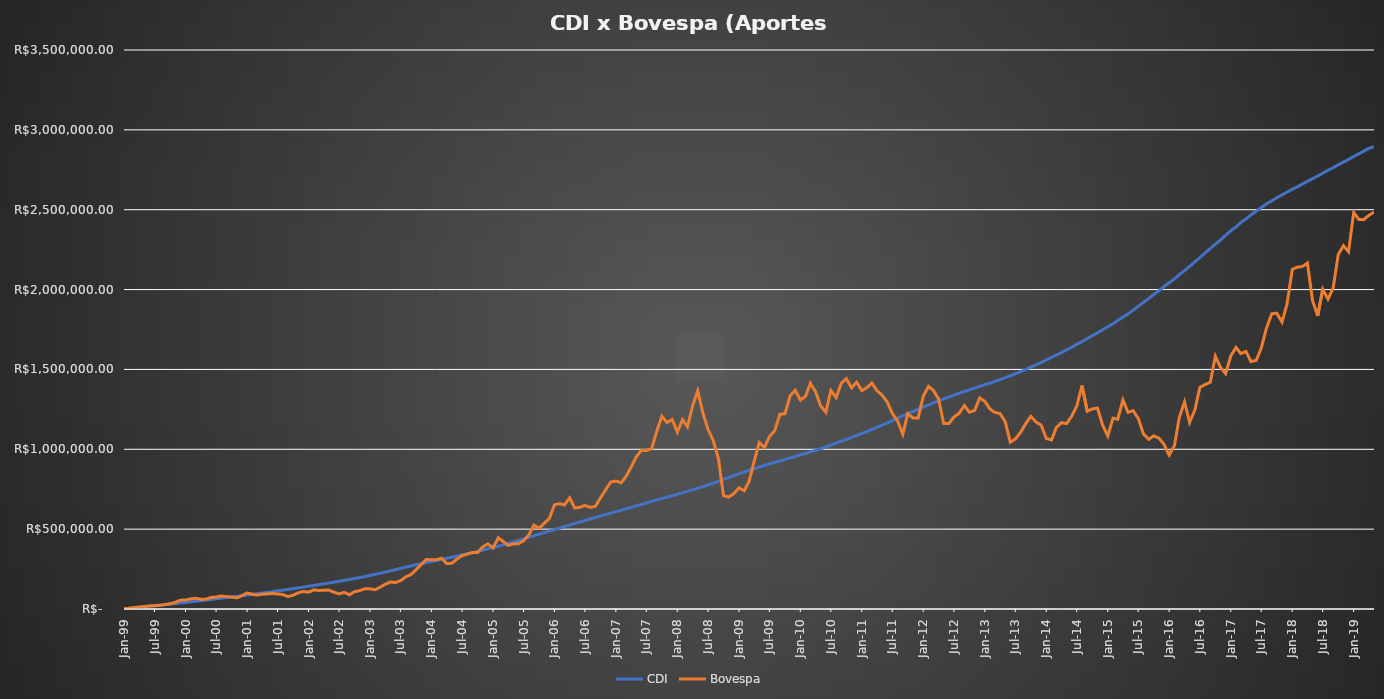
| Category | CDI | Bovespa |
|---|---|---|
| 1999-01-01 | 1000 | 1000 |
| 1999-01-01 | 1021.7 | 1204.5 |
| 1999-02-01 | 4116.21 | 4585.428 |
| 1999-03-01 | 7349.622 | 9104.789 |
| 1999-04-01 | 10585.593 | 12845.602 |
| 1999-05-01 | 13851.871 | 15481.153 |
| 1999-06-01 | 17128.241 | 19375.641 |
| 1999-07-01 | 20454.319 | 20095.563 |
| 1999-08-01 | 23817.861 | 23368.091 |
| 1999-09-01 | 27212.083 | 27718.137 |
| 1999-10-01 | 30629.01 | 32361.557 |
| 1999-11-01 | 34089.728 | 41645.306 |
| 1999-12-01 | 37675.745 | 55378.038 |
| 2000-01-01 | 41261.476 | 55972.862 |
| 2000-02-01 | 44898.841 | 63549.157 |
| 2000-03-01 | 48588.584 | 67154.754 |
| 2000-04-01 | 52248.918 | 61167.93 |
| 2000-05-01 | 56072.127 | 61768.049 |
| 2000-06-01 | 59893.23 | 72436.586 |
| 2000-07-01 | 63710.842 | 74206.97 |
| 2000-08-01 | 67644.794 | 81391.588 |
| 2000-09-01 | 71506.66 | 77488.356 |
| 2000-10-01 | 75460.345 | 75127.831 |
| 2000-11-01 | 79409.716 | 69822.843 |
| 2000-12-01 | 83390.391 | 83629.753 |
| 2001-01-01 | 87478.91 | 100334.58 |
| 2001-02-01 | 91392.747 | 92918.454 |
| 2001-03-01 | 95572.656 | 87151.507 |
| 2001-04-01 | 99735.814 | 93144.537 |
| 2001-05-01 | 104102.2 | 94423.55 |
| 2001-06-01 | 108462.398 | 96819.524 |
| 2001-07-01 | 113134.334 | 94299.505 |
| 2001-08-01 | 117992.483 | 90838.817 |
| 2001-09-01 | 122589.584 | 77726.692 |
| 2001-10-01 | 127523.664 | 86256.471 |
| 2001-11-01 | 132337.943 | 101564.938 |
| 2001-12-01 | 137219.14 | 109782.729 |
| 2002-01-01 | 142364.493 | 105666.139 |
| 2002-02-01 | 147181.549 | 119869.617 |
| 2002-03-01 | 152239.036 | 116050.354 |
| 2002-04-01 | 157536.574 | 117526.509 |
| 2002-05-01 | 162784.086 | 118465.506 |
| 2002-06-01 | 167955.858 | 105201.275 |
| 2002-07-01 | 173588.578 | 94827.597 |
| 2002-08-01 | 179149.112 | 104039.649 |
| 2002-09-01 | 184662.77 | 88896.429 |
| 2002-10-01 | 190740.439 | 108364.269 |
| 2002-11-01 | 196704.668 | 115094.972 |
| 2002-12-01 | 203159.559 | 126633.238 |
| 2003-01-01 | 210220.902 | 125860.911 |
| 2003-02-01 | 217122.845 | 121077.712 |
| 2003-03-01 | 224019.019 | 136063.619 |
| 2003-04-01 | 231264.275 | 154889.059 |
| 2003-05-01 | 238855.854 | 168767.615 |
| 2003-06-01 | 246330.188 | 166013.4 |
| 2003-07-01 | 254516.256 | 176821.819 |
| 2003-08-01 | 262048.542 | 201058.776 |
| 2003-09-01 | 269474.852 | 215302.414 |
| 2003-10-01 | 276916.192 | 245197.272 |
| 2003-11-01 | 283667.069 | 278576.618 |
| 2003-12-01 | 290594.408 | 310212.96 |
| 2004-01-01 | 297293.698 | 307794.376 |
| 2004-02-01 | 303536.87 | 309426.881 |
| 2004-03-01 | 310736.425 | 317988.079 |
| 2004-04-01 | 317407.141 | 284234.944 |
| 2004-05-01 | 324316.108 | 286315.792 |
| 2004-06-01 | 331309.365 | 313068.619 |
| 2004-07-01 | 338588.525 | 333831.675 |
| 2004-08-01 | 345995.016 | 343871.457 |
| 2004-09-01 | 353322.555 | 353600.763 |
| 2004-10-01 | 360634.058 | 353640.977 |
| 2004-11-01 | 368179.483 | 388774.329 |
| 2004-12-01 | 376672.94 | 408424.738 |
| 2005-01-01 | 384912.426 | 382460.437 |
| 2005-02-01 | 392644.958 | 445399.534 |
| 2005-03-01 | 401658.761 | 424051.44 |
| 2005-04-01 | 410364.45 | 398695.224 |
| 2005-05-01 | 419564.916 | 407559.974 |
| 2005-06-01 | 429241.442 | 408014.503 |
| 2005-07-01 | 438768.288 | 427290.677 |
| 2005-08-01 | 449057.465 | 463380.03 |
| 2005-09-01 | 458838.327 | 525237.19 |
| 2005-10-01 | 468304.063 | 504994.753 |
| 2005-11-01 | 477808.059 | 537001.254 |
| 2005-12-01 | 487875.938 | 566029.314 |
| 2006-01-01 | 497895.464 | 652847.332 |
| 2006-02-01 | 506605.672 | 659716.831 |
| 2006-03-01 | 516842.073 | 651384.374 |
| 2006-04-01 | 525456.367 | 695937.781 |
| 2006-05-01 | 535220.608 | 632538.692 |
| 2006-06-01 | 544571.612 | 637318.2 |
| 2006-07-01 | 553978.199 | 648130.082 |
| 2006-08-01 | 563940.427 | 636284.317 |
| 2006-09-01 | 572893.301 | 643120.022 |
| 2006-10-01 | 582170.538 | 696000.488 |
| 2006-11-01 | 591139.278 | 746532.521 |
| 2006-12-01 | 599961.843 | 794954.192 |
| 2007-01-01 | 609473.831 | 800986.418 |
| 2007-02-01 | 617802.353 | 790479.446 |
| 2007-03-01 | 627320.778 | 828075.15 |
| 2007-04-01 | 636245.793 | 888253.121 |
| 2007-05-01 | 645766.1 | 951590.957 |
| 2007-06-01 | 654604.995 | 993347.35 |
| 2007-07-01 | 663983.763 | 992461.595 |
| 2007-08-01 | 673586.903 | 1003823.472 |
| 2007-09-01 | 681999.598 | 1114251.537 |
| 2007-10-01 | 691301.594 | 1206966.835 |
| 2007-11-01 | 700133.728 | 1167134.009 |
| 2007-12-01 | 709040.051 | 1186515.885 |
| 2008-01-01 | 718602.212 | 1107677.193 |
| 2008-02-01 | 727337.506 | 1185314.7 |
| 2008-03-01 | 736459.926 | 1141138.606 |
| 2008-04-01 | 746100.276 | 1273655.096 |
| 2008-05-01 | 755624.939 | 1365510.291 |
| 2008-06-01 | 765818.221 | 1225774.668 |
| 2008-07-01 | 776998.447 | 1124574.576 |
| 2008-08-01 | 787898.271 | 1055071.531 |
| 2008-09-01 | 799584.707 | 941366.241 |
| 2008-10-01 | 812006.249 | 710163.413 |
| 2008-11-01 | 823123.711 | 700540.421 |
| 2008-12-01 | 835301.945 | 721902.826 |
| 2009-01-01 | 847042.92 | 758683.297 |
| 2009-02-01 | 857291.236 | 740051.492 |
| 2009-03-01 | 868605.951 | 796402.589 |
| 2009-04-01 | 878889.09 | 923709.691 |
| 2009-05-01 | 888647.888 | 1042455.732 |
| 2009-06-01 | 898347.73 | 1011373.875 |
| 2009-07-01 | 908414.296 | 1079395.24 |
| 2009-08-01 | 917715.815 | 1116490.691 |
| 2009-09-01 | 927082.565 | 1219125.362 |
| 2009-10-01 | 936511.295 | 1222614.212 |
| 2009-11-01 | 945702.675 | 1335061.561 |
| 2009-12-01 | 955569.385 | 1368836.977 |
| 2010-01-01 | 964878.688 | 1308046.558 |
| 2010-02-01 | 973613.37 | 1333072.14 |
| 2010-03-01 | 984005.356 | 1413831.538 |
| 2010-04-01 | 993558.085 | 1359591.544 |
| 2010-05-01 | 1004032.27 | 1272115.466 |
| 2010-06-01 | 1014995.882 | 1232399.098 |
| 2010-07-01 | 1026742.502 | 1368822.2 |
| 2010-08-01 | 1038869.11 | 1323671.241 |
| 2010-09-01 | 1050667.695 | 1413966.209 |
| 2010-10-01 | 1062156.042 | 1442329.904 |
| 2010-11-01 | 1073736.939 | 1384626.048 |
| 2010-12-01 | 1086719.367 | 1420374.023 |
| 2011-01-01 | 1099097.492 | 1367293.086 |
| 2011-02-01 | 1111381.561 | 1386873.632 |
| 2011-03-01 | 1124620.499 | 1414752.37 |
| 2011-04-01 | 1137078.979 | 1366996.836 |
| 2011-05-01 | 1151311.038 | 1338623.908 |
| 2011-06-01 | 1165307.004 | 1295606.208 |
| 2011-07-01 | 1179598.692 | 1224066.212 |
| 2011-08-01 | 1195279.697 | 1178474.39 |
| 2011-09-01 | 1209539.932 | 1094281.58 |
| 2011-10-01 | 1223218.771 | 1223359.233 |
| 2011-11-01 | 1236747.085 | 1195577.616 |
| 2011-12-01 | 1250961.837 | 1196060.603 |
| 2012-01-01 | 1265063.162 | 1332516.049 |
| 2012-02-01 | 1277465.85 | 1393477.445 |
| 2012-03-01 | 1290815.855 | 1368827.192 |
| 2012-04-01 | 1302871.273 | 1314621.998 |
| 2012-05-01 | 1315435.474 | 1161352.029 |
| 2012-06-01 | 1326853.684 | 1161441.149 |
| 2012-07-01 | 1338835.516 | 1201819.71 |
| 2012-08-01 | 1351047.217 | 1225542.609 |
| 2012-09-01 | 1361319.804 | 1274121.539 |
| 2012-10-01 | 1372603.954 | 1231656.013 |
| 2012-11-01 | 1383092.742 | 1243422.07 |
| 2012-12-01 | 1393497.25 | 1321830.606 |
| 2013-01-01 | 1404689.103 | 1298996.409 |
| 2013-02-01 | 1414467.126 | 1251088.349 |
| 2013-03-01 | 1425088.846 | 1230636.897 |
| 2013-04-01 | 1436668.804 | 1224014.529 |
| 2013-05-01 | 1448087.987 | 1174252.905 |
| 2013-06-01 | 1459676.977 | 1044105.601 |
| 2013-07-01 | 1473042.969 | 1064278.133 |
| 2013-08-01 | 1486311.8 | 1106553.968 |
| 2013-09-01 | 1499723.579 | 1161148.228 |
| 2013-10-01 | 1514794.957 | 1206756.053 |
| 2013-11-01 | 1528578.89 | 1170197.03 |
| 2013-12-01 | 1543529.8 | 1151375.565 |
| 2014-01-01 | 1559516.011 | 1067681.96 |
| 2014-02-01 | 1574744.261 | 1058476.186 |
| 2014-03-01 | 1589733.54 | 1136310.257 |
| 2014-04-01 | 1605720.689 | 1166653.703 |
| 2014-05-01 | 1622526.73 | 1160881.3 |
| 2014-06-01 | 1638813.786 | 1207643.237 |
| 2014-07-01 | 1657253.403 | 1271296.463 |
| 2014-08-01 | 1674523.281 | 1398922.658 |
| 2014-09-01 | 1692629.378 | 1237897.707 |
| 2014-10-01 | 1711649.684 | 1252686.235 |
| 2014-11-01 | 1729015.019 | 1257820.901 |
| 2014-12-01 | 1748569.619 | 1152138.14 |
| 2015-01-01 | 1767846.955 | 1083519.575 |
| 2015-02-01 | 1785341.337 | 1194845.577 |
| 2015-03-01 | 1806870.342 | 1187783.674 |
| 2015-04-01 | 1827031.533 | 1309028.493 |
| 2015-05-01 | 1848035.383 | 1231076.335 |
| 2015-06-01 | 1870763.718 | 1241604.2 |
| 2015-07-01 | 1895823.538 | 1192704.205 |
| 2015-08-01 | 1919851.11 | 1096102.045 |
| 2015-09-01 | 1944144.763 | 1062172.216 |
| 2015-10-01 | 1968713.286 | 1084345.316 |
| 2015-11-01 | 1992516.833 | 1069621.587 |
| 2015-12-01 | 2018690.77 | 1030574.821 |
| 2016-01-01 | 2043017.586 | 963395.091 |
| 2016-02-01 | 2066506.406 | 1023509.041 |
| 2016-03-01 | 2093523.028 | 1200707.625 |
| 2016-04-01 | 2118628.766 | 1296393.112 |
| 2016-05-01 | 2145123.683 | 1168284.347 |
| 2016-06-01 | 2173052.659 | 1245075.261 |
| 2016-07-01 | 2200150.266 | 1388109.305 |
| 2016-08-01 | 2229885.494 | 1405437.731 |
| 2016-09-01 | 2257612.468 | 1419705.233 |
| 2016-10-01 | 2284290.123 | 1582475.03 |
| 2016-11-01 | 2311004.747 | 1511750.442 |
| 2016-12-01 | 2339960.938 | 1473700.705 |
| 2017-01-01 | 2368372.693 | 1585681.217 |
| 2017-02-01 | 2391856.61 | 1637612.598 |
| 2017-03-01 | 2420012.184 | 1599269.161 |
| 2017-04-01 | 2442037.676 | 1612523.683 |
| 2017-05-01 | 2467666.499 | 1548964.107 |
| 2017-06-01 | 2490631.955 | 1556620 |
| 2017-07-01 | 2513508.696 | 1634481.76 |
| 2017-08-01 | 2536675.996 | 1759637.899 |
| 2017-09-01 | 2555871.51 | 1848654.629 |
| 2017-10-01 | 2575327.613 | 1852024.959 |
| 2017-11-01 | 2592957.044 | 1796591.673 |
| 2017-12-01 | 2609912.909 | 1910446.52 |
| 2018-01-01 | 2628154.03 | 2126604.463 |
| 2018-02-01 | 2643386.265 | 2140678.406 |
| 2018-03-01 | 2660451.808 | 2143892.774 |
| 2018-04-01 | 2677235.171 | 2165785.43 |
| 2018-05-01 | 2694105.388 | 1933038.454 |
| 2018-06-01 | 2711062.908 | 1835364.454 |
| 2018-07-01 | 2728778.557 | 2001611.218 |
| 2018-08-01 | 2747265.01 | 1940263.198 |
| 2018-09-01 | 2763139.001 | 2010888.757 |
| 2018-10-01 | 2781159.135 | 2219104.021 |
| 2018-11-01 | 2797898.961 | 2274990.097 |
| 2018-12-01 | 2814721.397 | 2236758.476 |
| 2019-01-01 | 2833021.624 | 2482100.343 |
| 2019-02-01 | 2850017.391 | 2438877.477 |
| 2019-03-01 | 2866392.336 | 2437482.098 |
| 2019-04-01 | 2884313.177 | 2464398.822 |
| 2019-05-01 | 2894531.46 | 2484670.614 |